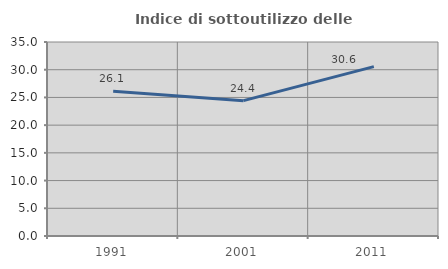
| Category | Indice di sottoutilizzo delle abitazioni  |
|---|---|
| 1991.0 | 26.136 |
| 2001.0 | 24.419 |
| 2011.0 | 30.556 |